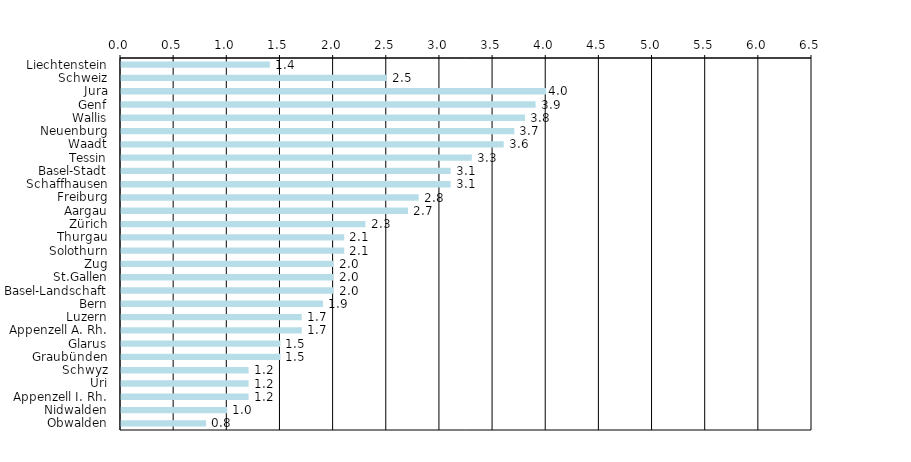
| Category | Series 0 |
|---|---|
| Liechtenstein | 1.4 |
| Schweiz | 2.5 |
| Jura | 4 |
| Genf | 3.9 |
| Wallis | 3.8 |
| Neuenburg | 3.7 |
| Waadt | 3.6 |
| Tessin | 3.3 |
| Basel-Stadt | 3.1 |
| Schaffhausen | 3.1 |
| Freiburg | 2.8 |
| Aargau | 2.7 |
| Zürich | 2.3 |
| Thurgau | 2.1 |
| Solothurn | 2.1 |
| Zug | 2 |
| St.Gallen | 2 |
| Basel-Landschaft | 2 |
| Bern | 1.9 |
| Luzern | 1.7 |
| Appenzell A. Rh. | 1.7 |
| Glarus | 1.5 |
| Graubünden | 1.5 |
| Schwyz | 1.2 |
| Uri | 1.2 |
| Appenzell I. Rh. | 1.2 |
| Nidwalden | 1 |
| Obwalden | 0.8 |